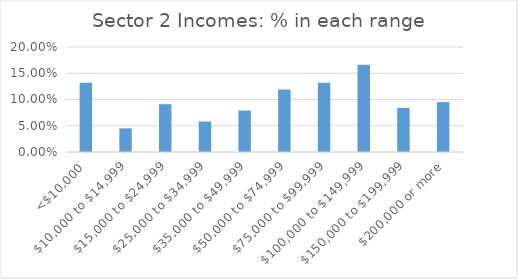
| Category | Series 0 |
|---|---|
| <$10,000 | 0.132 |
| $10,000 to $14,999 | 0.045 |
| $15,000 to $24,999 | 0.091 |
| $25,000 to $34,999 | 0.058 |
| $35,000 to $49,999 | 0.079 |
| $50,000 to $74,999 | 0.119 |
| $75,000 to $99,999 | 0.132 |
| $100,000 to $149,999 | 0.166 |
| $150,000 to $199,999 | 0.084 |
| $200,000 or more | 0.095 |